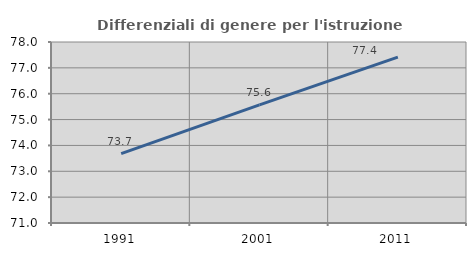
| Category | Differenziali di genere per l'istruzione superiore |
|---|---|
| 1991.0 | 73.682 |
| 2001.0 | 75.567 |
| 2011.0 | 77.412 |